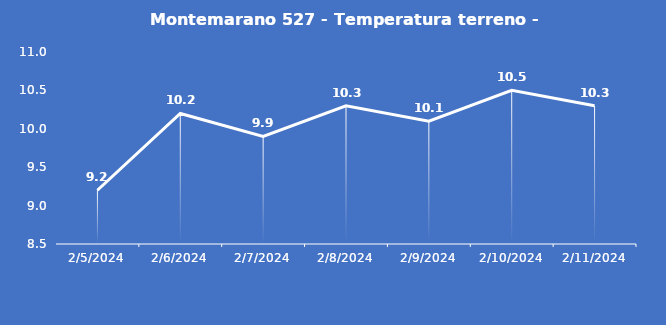
| Category | Montemarano 527 - Temperatura terreno - Grezzo (°C) |
|---|---|
| 2/5/24 | 9.2 |
| 2/6/24 | 10.2 |
| 2/7/24 | 9.9 |
| 2/8/24 | 10.3 |
| 2/9/24 | 10.1 |
| 2/10/24 | 10.5 |
| 2/11/24 | 10.3 |